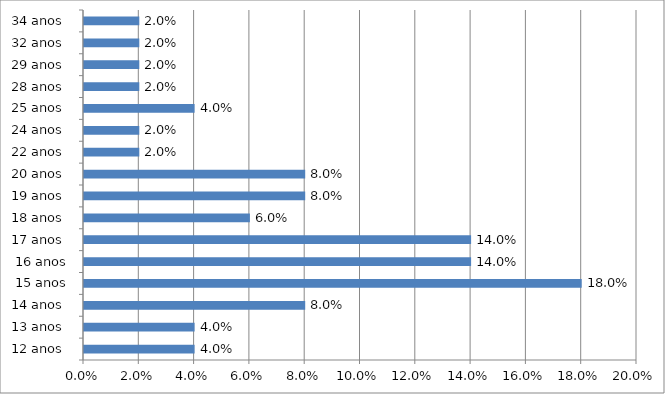
| Category | Series 0 |
|---|---|
| 12 anos  | 0.04 |
| 13 anos  | 0.04 |
| 14 anos  | 0.08 |
| 15 anos | 0.18 |
| 16 anos | 0.14 |
| 17 anos  | 0.14 |
| 18 anos  | 0.06 |
| 19 anos  | 0.08 |
| 20 anos  | 0.08 |
| 22 anos  | 0.02 |
| 24 anos  | 0.02 |
| 25 anos  | 0.04 |
| 28 anos  | 0.02 |
| 29 anos  | 0.02 |
| 32 anos  | 0.02 |
| 34 anos  | 0.02 |